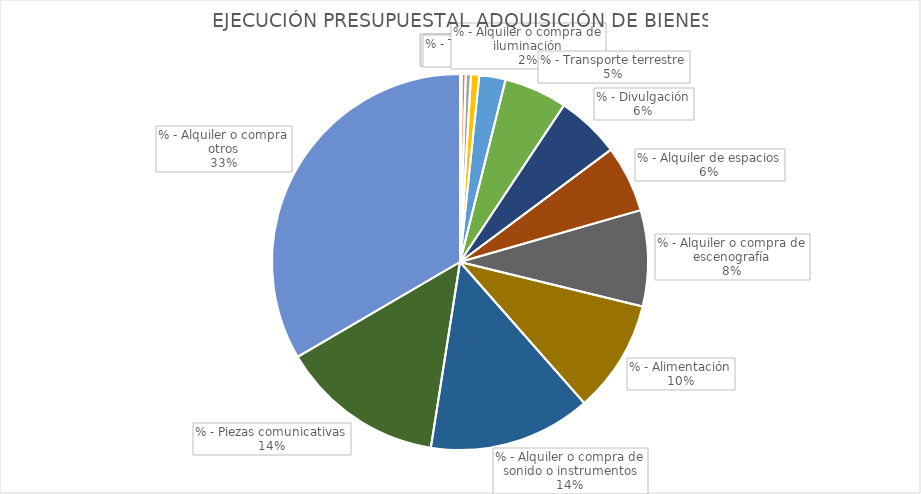
| Category | % |
|---|---|
| % - Permisos | 0.001 |
| % - Seguridad | 0.001 |
| % - Alojamiento | 0.002 |
| % - Transporte aéreo | 0.003 |
| % - Alquiler o compra de iluminación | 0.009 |
| % - Transporte terrestre | 0.021 |
| % - Divulgación | 0.022 |
| % - Alquiler de espacios | 0.023 |
| % - Alquiler o compra de escenografía | 0.032 |
| % - Alimentación | 0.038 |
| % - Alquiler o compra de sonido o instrumentos | 0.055 |
| % - Piezas comunicativas | 0.055 |
| % - Alquiler o compra otros | 0.131 |